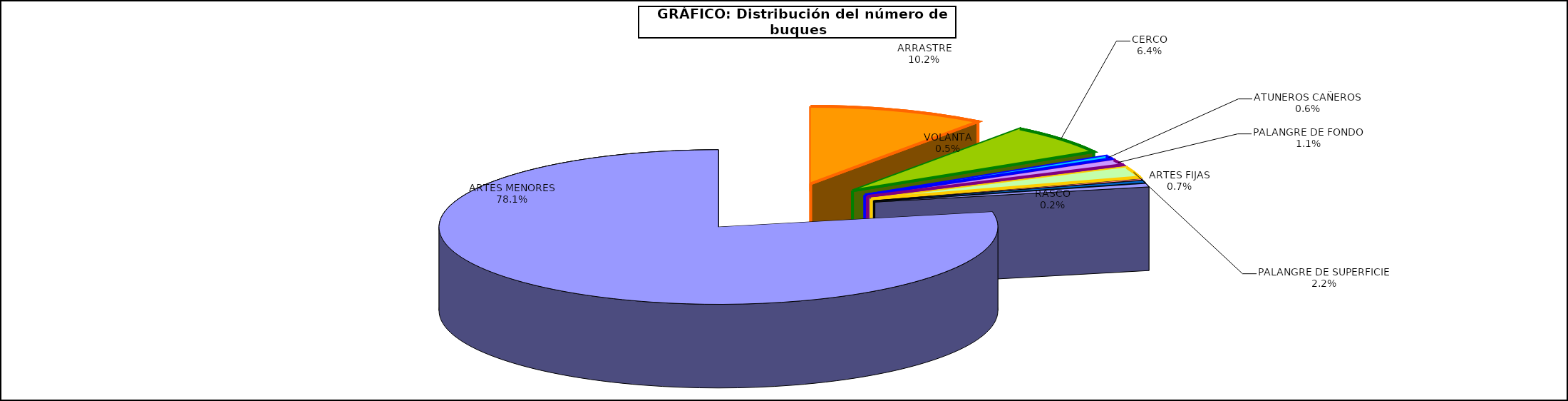
| Category | Series 0 |
|---|---|
| ARRASTRE | 884 |
| CERCO | 550 |
| ATUNEROS CAÑEROS | 53 |
| PALANGRE DE FONDO | 98 |
| PALANGRE DE SUPERFICIE | 188 |
| RASCO | 21 |
| VOLANTA | 40 |
| ARTES FIJAS | 58 |
| ARTES MENORES | 6765 |